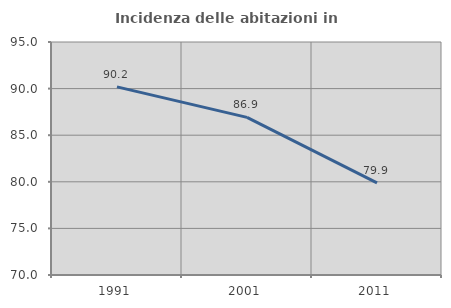
| Category | Incidenza delle abitazioni in proprietà  |
|---|---|
| 1991.0 | 90.184 |
| 2001.0 | 86.917 |
| 2011.0 | 79.888 |